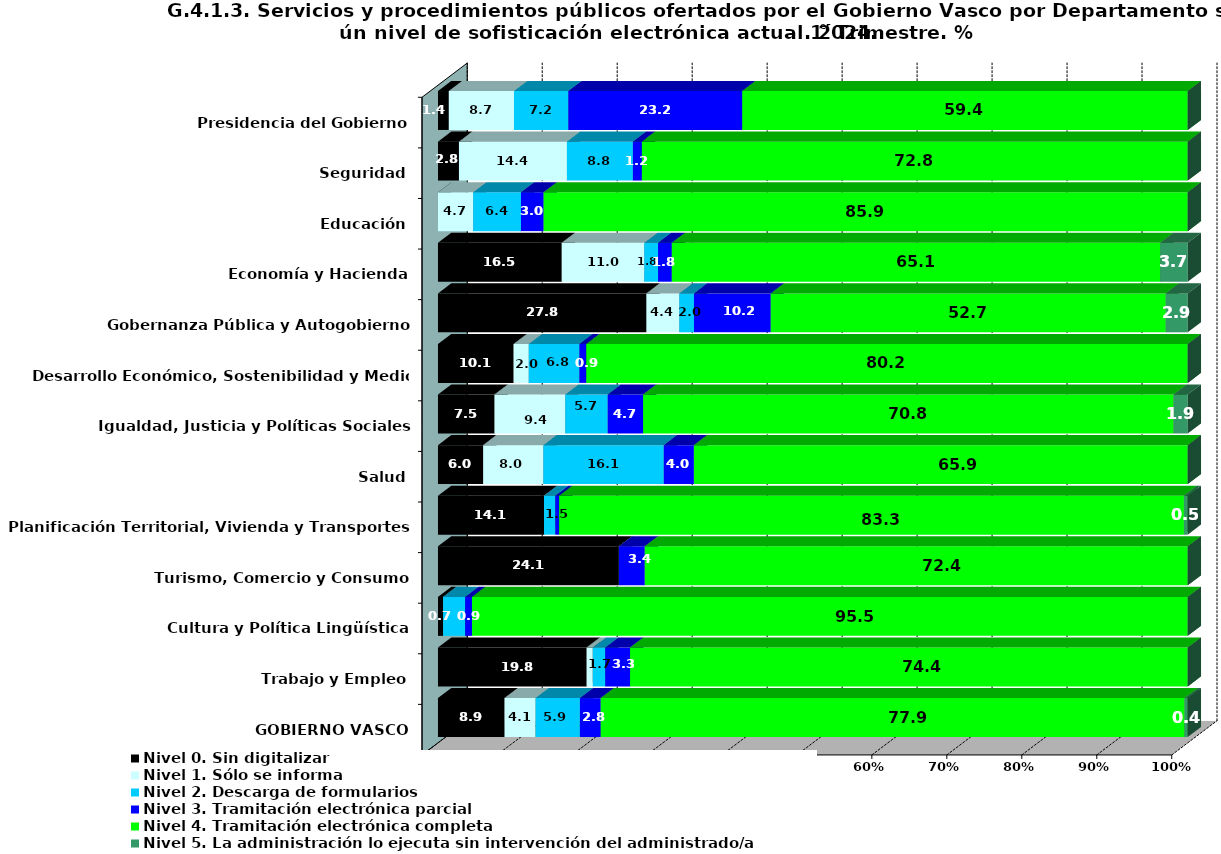
| Category | Nivel 0. Sin digitalizar | Nivel 1. Sólo se informa | Nivel 2. Descarga de formularios | Nivel 3. Tramitación electrónica parcial | Nivel 4. Tramitación electrónica completa | Nivel 5. La administración lo ejecuta sin intervención del administrado/a |
|---|---|---|---|---|---|---|
| Presidencia del Gobierno | 1.449 | 8.696 | 7.246 | 23.188 | 59.42 | 0 |
| Seguridad | 2.8 | 14.4 | 8.8 | 1.2 | 72.8 | 0 |
| Educación | 0 | 4.698 | 6.376 | 3.02 | 85.906 | 0 |
| Economía y Hacienda | 16.514 | 11.009 | 1.835 | 1.835 | 65.138 | 3.67 |
| Gobernanza Pública y Autogobierno | 27.805 | 4.39 | 1.951 | 10.244 | 52.683 | 2.927 |
| Desarrollo Económico, Sostenibilidad y Medio Ambiente | 10.091 | 2.018 | 6.761 | 0.908 | 80.222 | 0 |
| Igualdad, Justicia y Políticas Sociales | 7.547 | 9.434 | 5.66 | 4.717 | 70.755 | 1.887 |
| Salud | 6.024 | 8.032 | 16.064 | 4.016 | 65.863 | 0 |
| Planificación Territorial, Vivienda y Transportes | 14.141 | 0 | 1.515 | 0.505 | 83.333 | 0.505 |
| Turismo, Comercio y Consumo | 24.138 | 0 | 0 | 3.448 | 72.414 | 0 |
| Cultura y Política Lingüística | 0.68 | 0 | 2.948 | 0.907 | 95.465 | 0 |
| Trabajo y Empleo | 19.835 | 0.826 | 1.653 | 3.306 | 74.38 | 0 |
| GOBIERNO VASCO | 8.885 | 4.136 | 5.913 | 2.779 | 77.868 | 0.42 |